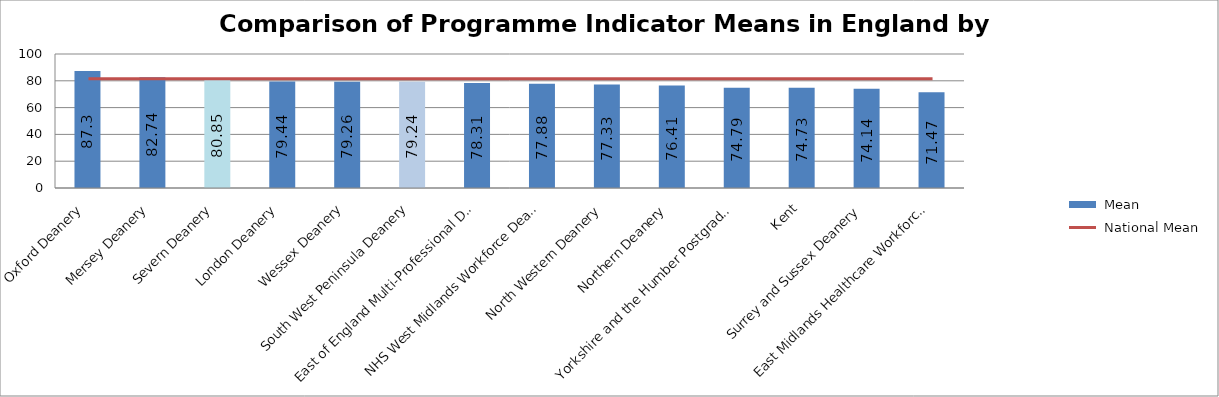
| Category |  Mean |
|---|---|
| Oxford Deanery | 87.3 |
| Mersey Deanery | 82.74 |
| Severn Deanery | 80.85 |
| London Deanery | 79.44 |
| Wessex Deanery | 79.26 |
| South West Peninsula Deanery | 79.24 |
| East of England Multi-Professional Deanery | 78.31 |
| NHS West Midlands Workforce Deanery | 77.88 |
| North Western Deanery | 77.33 |
| Northern Deanery | 76.41 |
| Yorkshire and the Humber Postgraduate Deanery | 74.79 |
| Kent, Surrey and Sussex Deanery | 74.73 |
| East Midlands Healthcare Workforce Deanery | 74.14 |
| Wales Deanery | 71.47 |